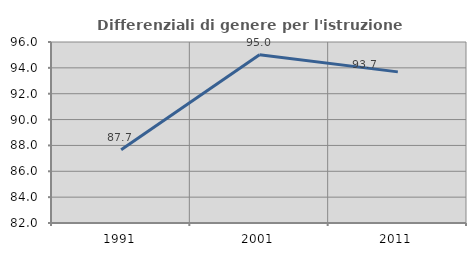
| Category | Differenziali di genere per l'istruzione superiore |
|---|---|
| 1991.0 | 87.667 |
| 2001.0 | 95.02 |
| 2011.0 | 93.689 |